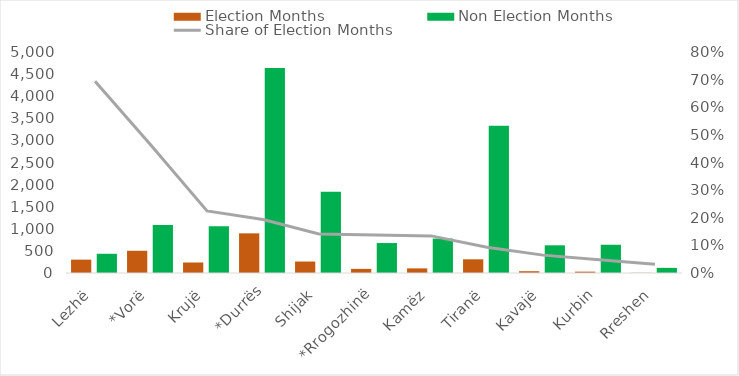
| Category | Election Months | Non Election Months |
|---|---|---|
| Lezhë | 302.088 | 435.103 |
| *Vorë | 502.766 | 1086.81 |
| Krujë | 237.763 | 1057.328 |
| *Durrës | 897.468 | 4636.664 |
| Shijak | 259.642 | 1837.519 |
| *Rrogozhinë | 93.198 | 677.9 |
| Kamëz | 104.558 | 778.486 |
| Tiranë | 309.685 | 3332.322 |
| Kavajë | 40.537 | 626.402 |
| Kurbin | 30.603 | 639.164 |
| Rreshen | 3.697 | 116.266 |